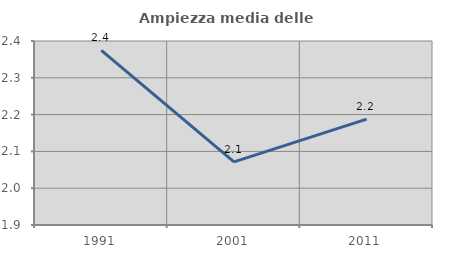
| Category | Ampiezza media delle famiglie |
|---|---|
| 1991.0 | 2.375 |
| 2001.0 | 2.071 |
| 2011.0 | 2.188 |